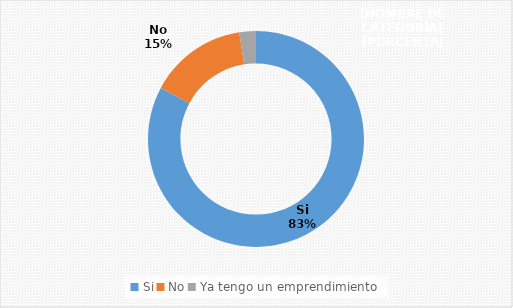
| Category | Series 0 |
|---|---|
| Si | 0.828 |
| No | 0.147 |
| Ya tengo un emprendimiento | 0.025 |